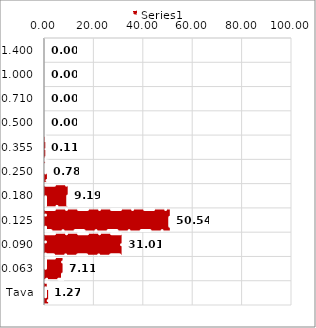
| Category | Series 0 |
|---|---|
| 1,400 | 0 |
| 1,000 | 0 |
| 0,710 | 0 |
| 0,500 | 0 |
| 0,355 | 0.113 |
| 0,250 | 0.78 |
| 0,180 | 9.187 |
| 0,125 | 50.535 |
| 0,090 | 31.007 |
| 0,063 | 7.111 |
| Tava | 1.268 |